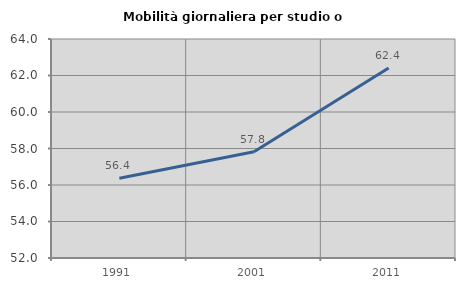
| Category | Mobilità giornaliera per studio o lavoro |
|---|---|
| 1991.0 | 56.365 |
| 2001.0 | 57.819 |
| 2011.0 | 62.406 |